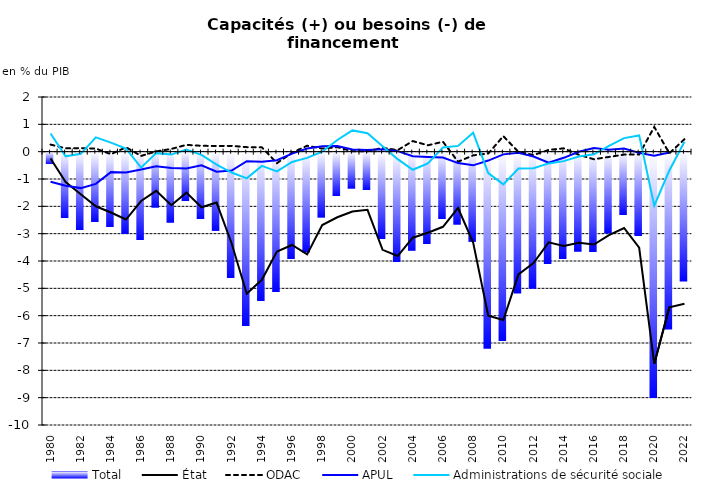
| Category | Total |
|---|---|
| 1980.0 | -0.429 |
| 1981.0 | -2.408 |
| 1982.0 | -2.837 |
| 1983.0 | -2.541 |
| 1984.0 | -2.736 |
| 1985.0 | -2.972 |
| 1986.0 | -3.197 |
| 1987.0 | -2.014 |
| 1988.0 | -2.564 |
| 1989.0 | -1.782 |
| 1990.0 | -2.434 |
| 1991.0 | -2.863 |
| 1992.0 | -4.601 |
| 1993.0 | -6.359 |
| 1994.0 | -5.423 |
| 1995.0 | -5.109 |
| 1996.0 | -3.906 |
| 1997.0 | -3.653 |
| 1998.0 | -2.379 |
| 1999.0 | -1.603 |
| 2000.0 | -1.318 |
| 2001.0 | -1.379 |
| 2002.0 | -3.16 |
| 2003.0 | -4.015 |
| 2004.0 | -3.591 |
| 2005.0 | -3.356 |
| 2006.0 | -2.444 |
| 2007.0 | -2.636 |
| 2008.0 | -3.264 |
| 2009.0 | -7.175 |
| 2010.0 | -6.887 |
| 2011.0 | -5.155 |
| 2012.0 | -4.981 |
| 2013.0 | -4.084 |
| 2014.0 | -3.905 |
| 2015.0 | -3.625 |
| 2016.0 | -3.637 |
| 2017.0 | -2.958 |
| 2018.0 | -2.289 |
| 2019.0 | -3.065 |
| 2020.0 | -8.984 |
| 2021.0 | -6.474 |
| 2022.0 | -4.716 |